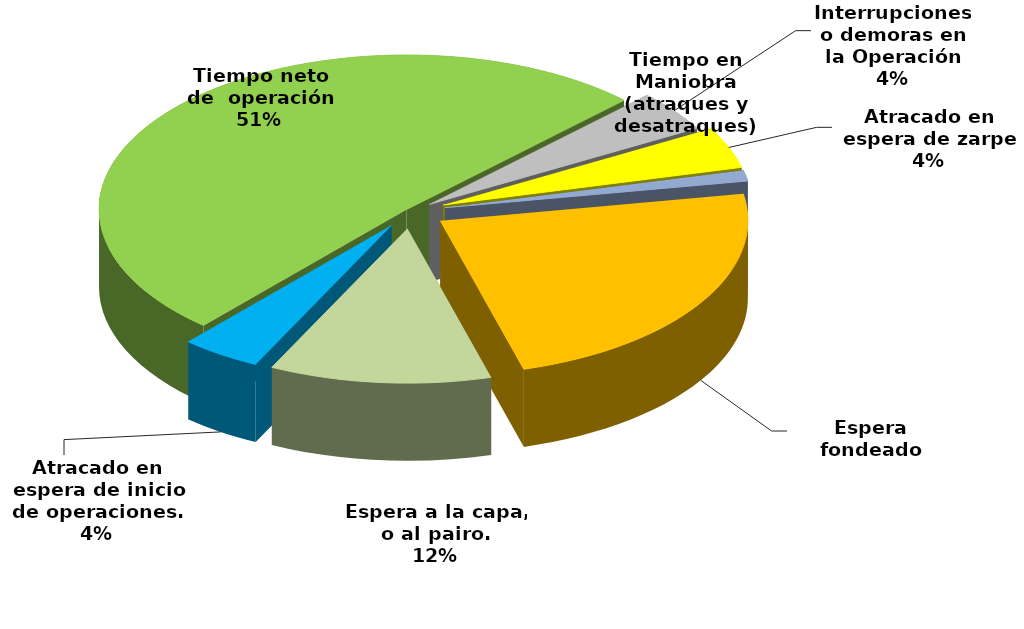
| Category | Series 0 |
|---|---|
| Espera fondeado | 60821.333 |
| Espera a la capa, o al pairo. | 30288.767 |
| Atracado en espera de inicio de operaciones. | 10900.114 |
| Tiempo neto de  operación | 132647.95 |
| Interrupciones o demoras en la Operación | 11141.45 |
| Atracado en espera de zarpe | 11181.317 |
| Tiempo en Maniobra (atraques y desatraques) | 2942.167 |